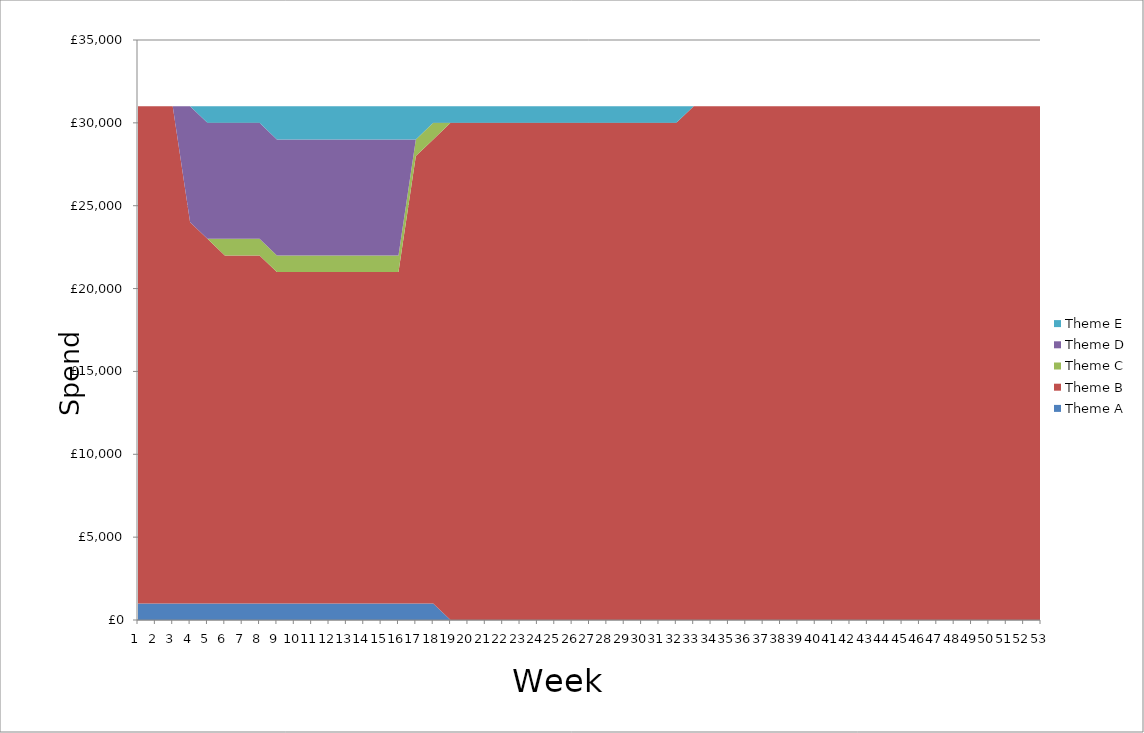
| Category | Theme A | Theme B | Theme C | Theme D | Theme E |
|---|---|---|---|---|---|
| 0 | 1000 | 30000 | 0 | 0 | 0 |
| 1 | 1000 | 30000 | 0 | 0 | 0 |
| 2 | 1000 | 30000 | 0 | 0 | 0 |
| 3 | 1000 | 23000 | 0 | 7000 | 0 |
| 4 | 1000 | 22000 | 0 | 7000 | 1000 |
| 5 | 1000 | 21000 | 1000 | 7000 | 1000 |
| 6 | 1000 | 21000 | 1000 | 7000 | 1000 |
| 7 | 1000 | 21000 | 1000 | 7000 | 1000 |
| 8 | 1000 | 20000 | 1000 | 7000 | 2000 |
| 9 | 1000 | 20000 | 1000 | 7000 | 2000 |
| 10 | 1000 | 20000 | 1000 | 7000 | 2000 |
| 11 | 1000 | 20000 | 1000 | 7000 | 2000 |
| 12 | 1000 | 20000 | 1000 | 7000 | 2000 |
| 13 | 1000 | 20000 | 1000 | 7000 | 2000 |
| 14 | 1000 | 20000 | 1000 | 7000 | 2000 |
| 15 | 1000 | 20000 | 1000 | 7000 | 2000 |
| 16 | 1000 | 27000 | 1000 | 0 | 2000 |
| 17 | 1000 | 28000 | 1000 | 0 | 1000 |
| 18 | 0 | 30000 | 0 | 0 | 1000 |
| 19 | 0 | 30000 | 0 | 0 | 1000 |
| 20 | 0 | 30000 | 0 | 0 | 1000 |
| 21 | 0 | 30000 | 0 | 0 | 1000 |
| 22 | 0 | 30000 | 0 | 0 | 1000 |
| 23 | 0 | 30000 | 0 | 0 | 1000 |
| 24 | 0 | 30000 | 0 | 0 | 1000 |
| 25 | 0 | 30000 | 0 | 0 | 1000 |
| 26 | 0 | 30000 | 0 | 0 | 1000 |
| 27 | 0 | 30000 | 0 | 0 | 1000 |
| 28 | 0 | 30000 | 0 | 0 | 1000 |
| 29 | 0 | 30000 | 0 | 0 | 1000 |
| 30 | 0 | 30000 | 0 | 0 | 1000 |
| 31 | 0 | 30000 | 0 | 0 | 1000 |
| 32 | 0 | 31000 | 0 | 0 | 0 |
| 33 | 0 | 31000 | 0 | 0 | 0 |
| 34 | 0 | 31000 | 0 | 0 | 0 |
| 35 | 0 | 31000 | 0 | 0 | 0 |
| 36 | 0 | 31000 | 0 | 0 | 0 |
| 37 | 0 | 31000 | 0 | 0 | 0 |
| 38 | 0 | 31000 | 0 | 0 | 0 |
| 39 | 0 | 31000 | 0 | 0 | 0 |
| 40 | 0 | 31000 | 0 | 0 | 0 |
| 41 | 0 | 31000 | 0 | 0 | 0 |
| 42 | 0 | 31000 | 0 | 0 | 0 |
| 43 | 0 | 31000 | 0 | 0 | 0 |
| 44 | 0 | 31000 | 0 | 0 | 0 |
| 45 | 0 | 31000 | 0 | 0 | 0 |
| 46 | 0 | 31000 | 0 | 0 | 0 |
| 47 | 0 | 31000 | 0 | 0 | 0 |
| 48 | 0 | 31000 | 0 | 0 | 0 |
| 49 | 0 | 31000 | 0 | 0 | 0 |
| 50 | 0 | 31000 | 0 | 0 | 0 |
| 51 | 0 | 31000 | 0 | 0 | 0 |
| 52 | 0 | 31000 | 0 | 0 | 0 |